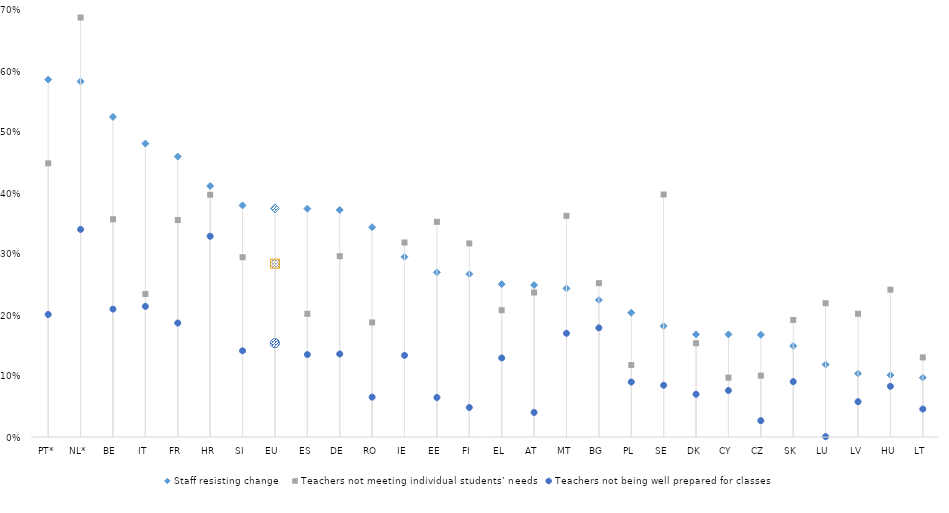
| Category | Staff resisting change | Teachers not meeting individual students’ needs | Teachers not being well prepared for classes |
|---|---|---|---|
| PT* | 0.586 | 0.449 | 0.201 |
| NL* | 0.583 | 0.688 | 0.34 |
| BE | 0.525 | 0.357 | 0.21 |
| IT | 0.481 | 0.234 | 0.214 |
| FR | 0.46 | 0.356 | 0.187 |
| HR | 0.412 | 0.397 | 0.329 |
| SI | 0.38 | 0.295 | 0.141 |
| EU | 0.375 | 0.284 | 0.154 |
| ES | 0.374 | 0.202 | 0.135 |
| DE | 0.372 | 0.296 | 0.136 |
| RO | 0.344 | 0.188 | 0.065 |
| IE | 0.295 | 0.319 | 0.134 |
| EE | 0.27 | 0.353 | 0.065 |
| FI | 0.267 | 0.317 | 0.048 |
| EL | 0.25 | 0.208 | 0.13 |
| AT | 0.249 | 0.237 | 0.04 |
| MT | 0.244 | 0.363 | 0.17 |
| BG | 0.224 | 0.252 | 0.179 |
| PL | 0.204 | 0.118 | 0.09 |
| SE | 0.182 | 0.398 | 0.085 |
| DK | 0.168 | 0.154 | 0.07 |
| CY | 0.168 | 0.097 | 0.076 |
| CZ | 0.168 | 0.101 | 0.027 |
| SK | 0.149 | 0.192 | 0.091 |
| LU | 0.119 | 0.219 | 0.001 |
| LV | 0.104 | 0.202 | 0.058 |
| HU | 0.102 | 0.242 | 0.083 |
| LT | 0.097 | 0.13 | 0.046 |